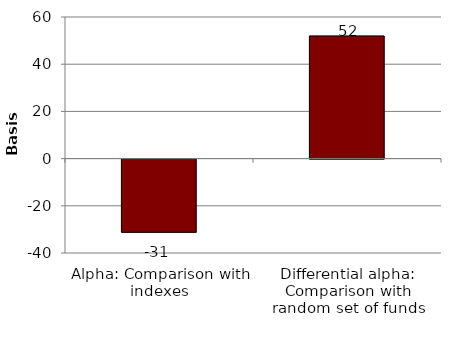
| Category | Series 0 |
|---|---|
| Alpha: Comparison with indexes | -31 |
| Differential alpha: Comparison with random set of funds | 52 |